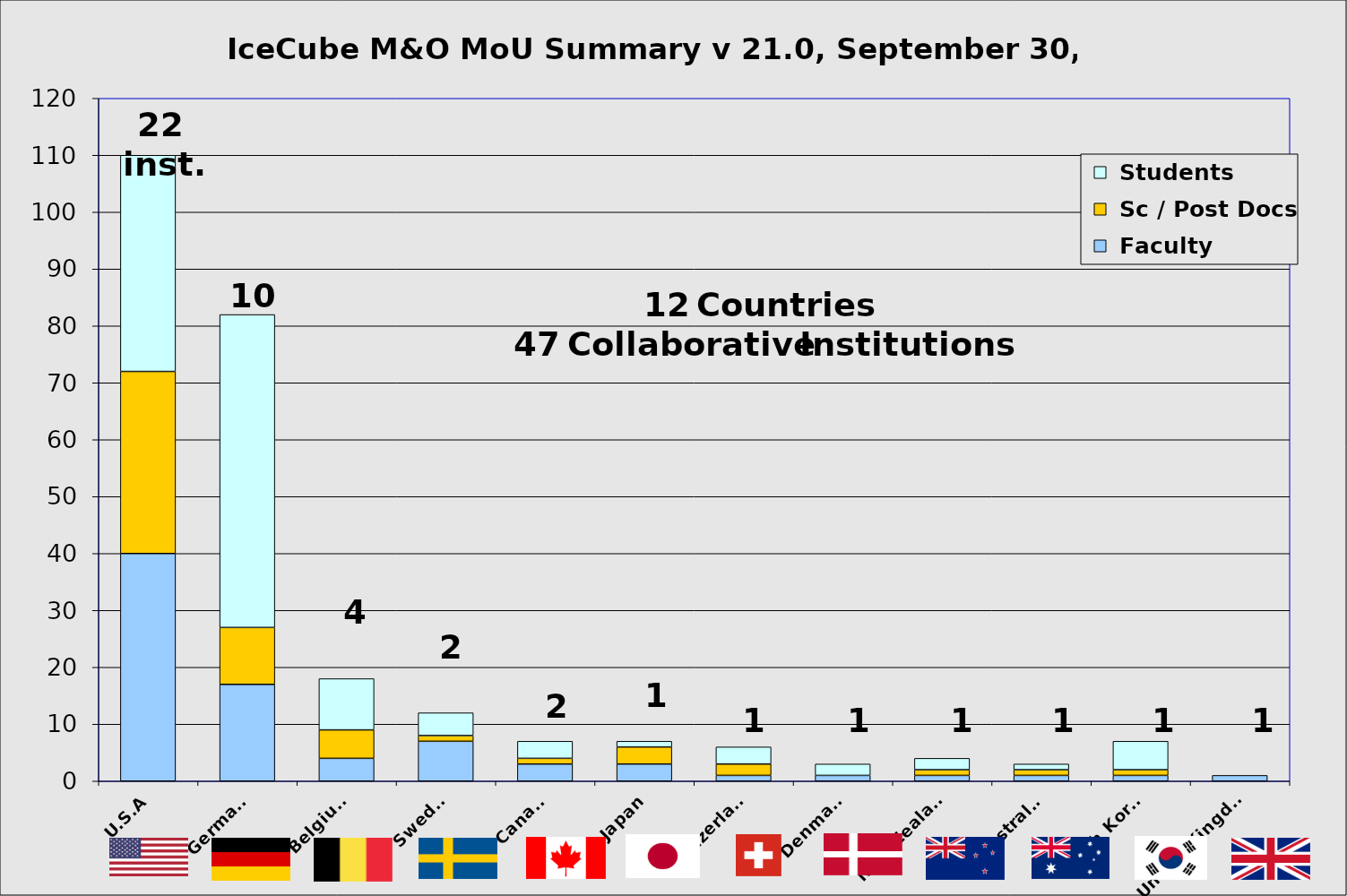
| Category |  Faculty |  Sc / Post Docs |  Students |
|---|---|---|---|
| U.S.A | 40 | 32 | 38 |
| Germany | 17 | 10 | 55 |
| Belgium | 4 | 5 | 9 |
| Sweden | 7 | 1 | 4 |
| Canada | 3 | 1 | 3 |
| Japan | 3 | 3 | 1 |
| Switzerland | 1 | 2 | 3 |
| Denmark | 1 | 0 | 2 |
| New Zealand | 1 | 1 | 2 |
| Australia | 1 | 1 | 1 |
| South Korea | 1 | 1 | 5 |
| United Kingdom | 1 | 0 | 0 |